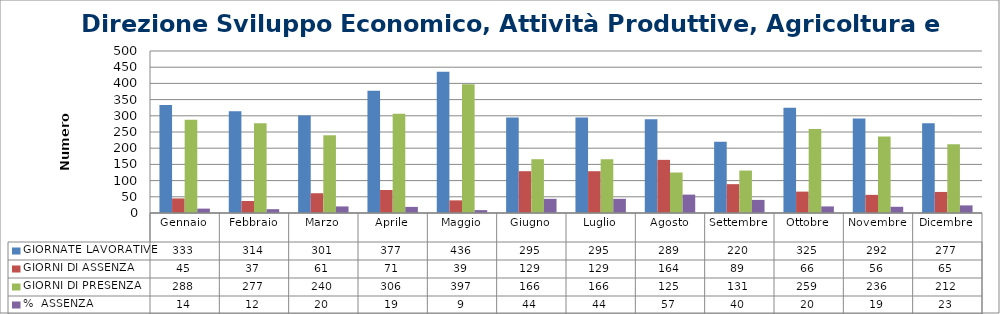
| Category | GIORNATE LAVORATIVE | GIORNI DI ASSENZA | GIORNI DI PRESENZA | %  ASSENZA |
|---|---|---|---|---|
| Gennaio | 333 | 45 | 288 | 13.514 |
| Febbraio | 314 | 37 | 277 | 11.783 |
| Marzo | 301 | 61 | 240 | 20.266 |
| Aprile | 377 | 71 | 306 | 18.833 |
| Maggio | 436 | 39 | 397 | 8.945 |
| Giugno | 295 | 129 | 166 | 43.729 |
| Luglio | 295 | 129 | 166 | 43.729 |
| Agosto | 289 | 164 | 125 | 56.747 |
| Settembre | 220 | 89 | 131 | 40.455 |
| Ottobre | 325 | 66 | 259 | 20.308 |
| Novembre | 292 | 56 | 236 | 19.178 |
| Dicembre | 277 | 65 | 212 | 23.466 |